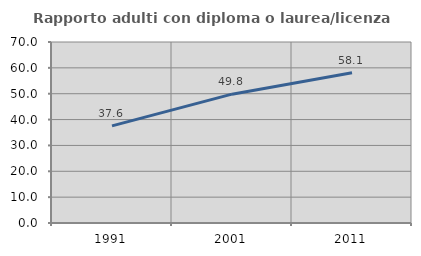
| Category | Rapporto adulti con diploma o laurea/licenza media  |
|---|---|
| 1991.0 | 37.566 |
| 2001.0 | 49.828 |
| 2011.0 | 58.131 |